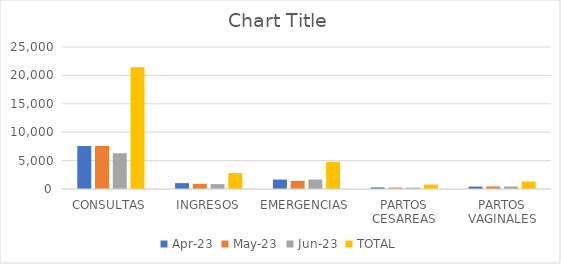
| Category | abr-23 | may-23 | jun-23 | TOTAL |
|---|---|---|---|---|
| CONSULTAS | 7564 | 7587 | 6295 | 21446 |
| INGRESOS | 1031 | 904 | 864 | 2799 |
| EMERGENCIAS | 1655 | 1428 | 1664 | 4747 |
| PARTOS CESAREAS | 282 | 247 | 247 | 776 |
| PARTOS VAGINALES | 425 | 449 | 434 | 1308 |